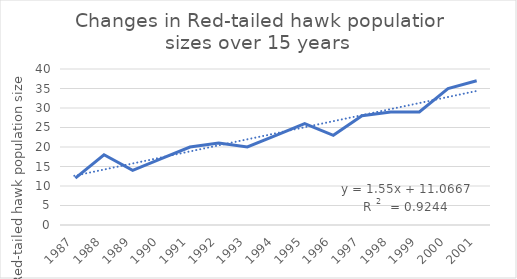
| Category | Series 0 |
|---|---|
| 1987.0 | 12 |
| 1988.0 | 18 |
| 1989.0 | 14 |
| 1990.0 | 17 |
| 1991.0 | 20 |
| 1992.0 | 21 |
| 1993.0 | 20 |
| 1994.0 | 23 |
| 1995.0 | 26 |
| 1996.0 | 23 |
| 1997.0 | 28 |
| 1998.0 | 29 |
| 1999.0 | 29 |
| 2000.0 | 35 |
| 2001.0 | 37 |